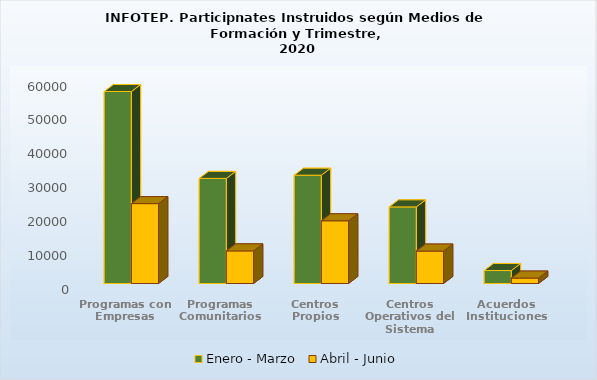
| Category | Enero - Marzo | Abril - Junio |
|---|---|---|
| Programas con Empresas | 56626 | 23566 |
| Programas Comunitarios | 30999 | 9619 |
| Centros Propios | 31945 | 18502 |
| Centros Operativos del Sistema | 22599 | 9571 |
| Acuerdos Instituciones | 3832 | 1603 |